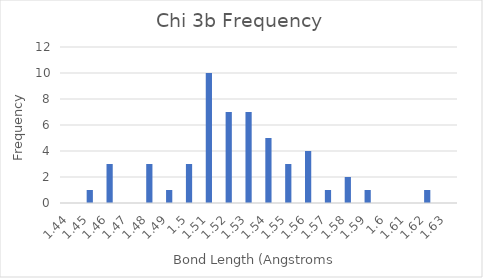
| Category | Chi 3b |
|---|---|
| 1.44 | 0 |
| 1.45 | 1 |
| 1.46 | 3 |
| 1.47 | 0 |
| 1.48 | 3 |
| 1.49 | 1 |
| 1.5 | 3 |
| 1.51 | 10 |
| 1.52 | 7 |
| 1.53 | 7 |
| 1.54 | 5 |
| 1.55 | 3 |
| 1.56 | 4 |
| 1.57 | 1 |
| 1.58 | 2 |
| 1.59 | 1 |
| 1.6 | 0 |
| 1.61 | 0 |
| 1.62 | 1 |
| 1.63 | 0 |